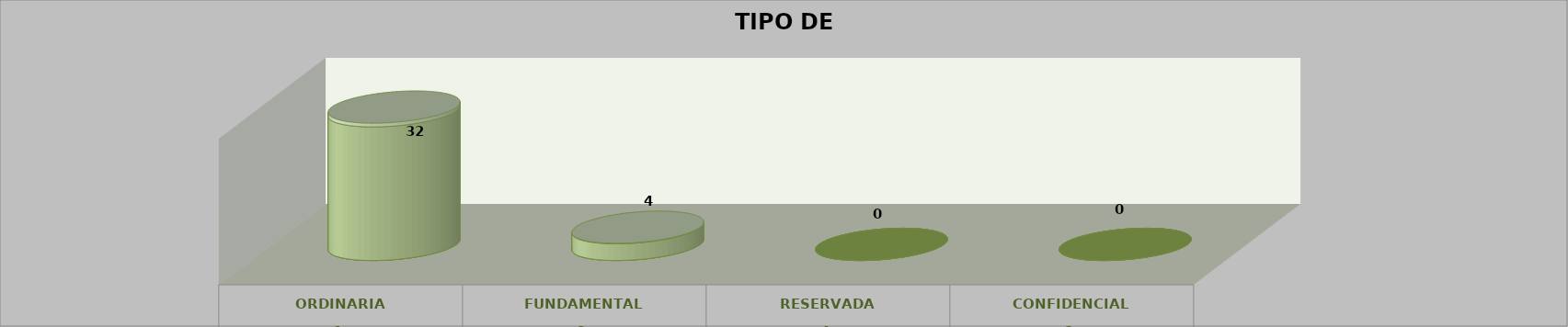
| Category | Series 0 | Series 2 | Series 1 | Series 3 | Series 4 |
|---|---|---|---|---|---|
| 0 |  |  |  | 32 | 0.889 |
| 1 |  |  |  | 4 | 0.111 |
| 2 |  |  |  | 0 | 0 |
| 3 |  |  |  | 0 | 0 |